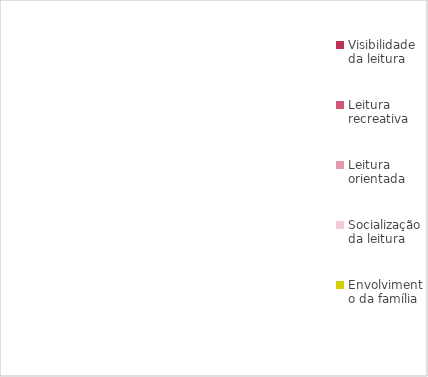
| Category | Series 0 |
|---|---|
| Visibilidade da leitura | 0 |
| Leitura recreativa | 0 |
| Leitura orientada | 0 |
| Socialização da leitura | 0 |
| Envolvimento da família | 0 |